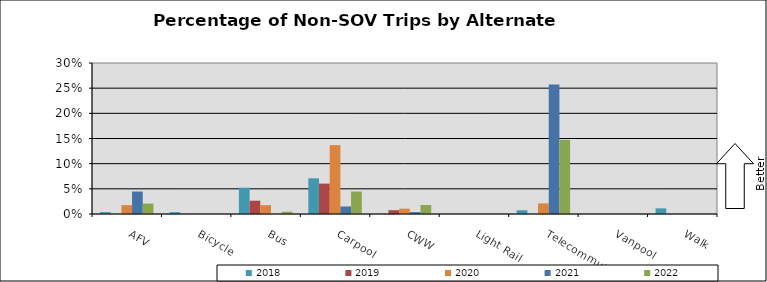
| Category | 2018 | 2019 | 2020 | 2021 | 2022 |
|---|---|---|---|---|---|
| AFV | 0.004 | 0 | 0.018 | 0.045 | 0.021 |
| Bicycle | 0.004 | 0 | 0 | 0 | 0 |
| Bus | 0.052 | 0.026 | 0.018 | 0 | 0.004 |
| Carpool | 0.071 | 0.06 | 0.137 | 0.015 | 0.045 |
| CWW | 0 | 0.008 | 0.011 | 0.004 | 0.018 |
| Light Rail | 0 | 0 | 0 | 0 | 0 |
| Telecommute | 0.007 | 0 | 0.021 | 0.257 | 0.147 |
| Vanpool | 0 | 0 | 0 | 0 | 0 |
| Walk | 0.011 | 0 | 0 | 0 | 0 |